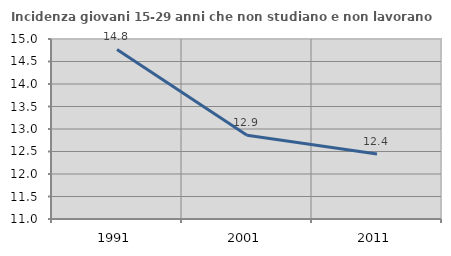
| Category | Incidenza giovani 15-29 anni che non studiano e non lavorano  |
|---|---|
| 1991.0 | 14.768 |
| 2001.0 | 12.863 |
| 2011.0 | 12.444 |